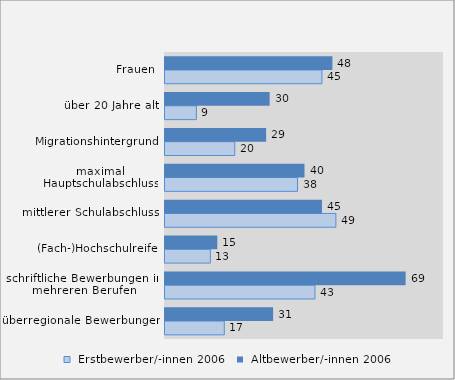
| Category |  Erstbewerber/-innen 2006 |  Altbewerber/-innen 2006 |
|---|---|---|
| überregionale Bewerbungen | 17 | 31 |
| schriftliche Bewerbungen in mehreren Berufen | 43 | 69 |
| (Fach-)Hochschulreife | 13 | 15 |
| mittlerer Schulabschluss | 49 | 45 |
| maximal Hauptschulabschluss | 38 | 40 |
| Migrationshintergrund | 20 | 29 |
| über 20 Jahre alt | 9 | 30 |
| Frauen | 45 | 48 |